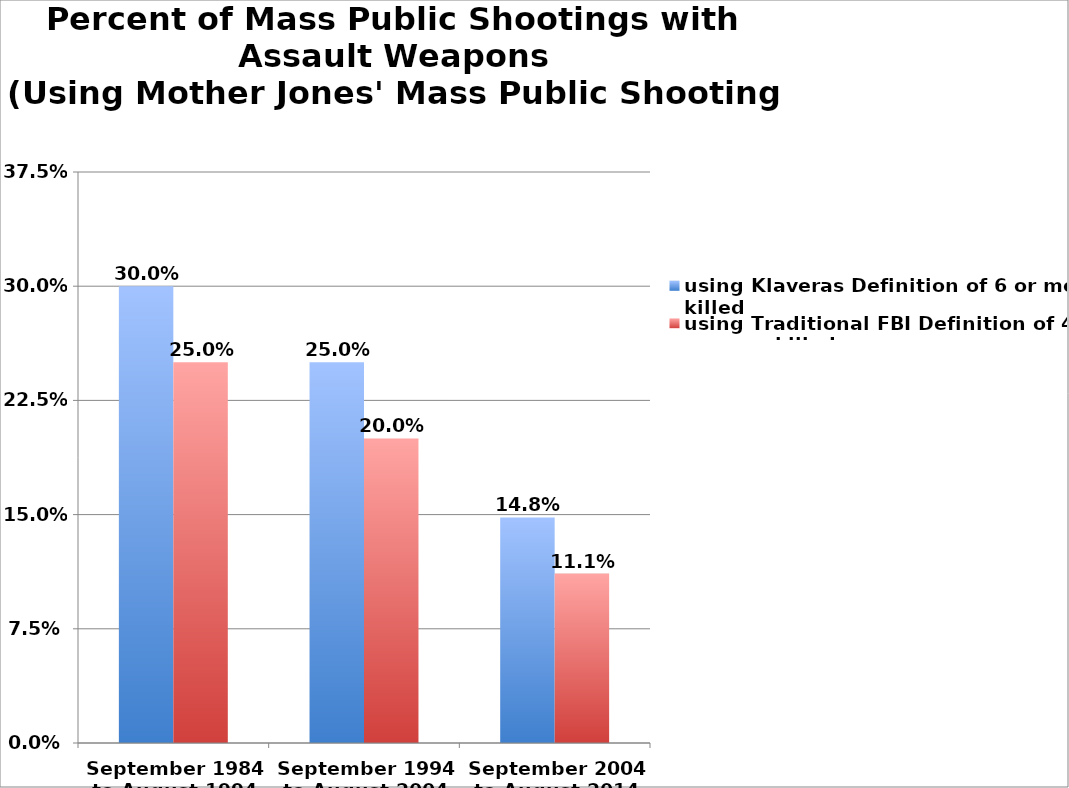
| Category | using Klaveras Definition of 6 or more killed | using Traditional FBI Definition of 4 or more killed |
|---|---|---|
| September 1984 to August 1994 | 0.3 | 0.25 |
| September 1994 to August 2004 | 0.25 | 0.2 |
| September 2004 to August 2014 | 0.148 | 0.111 |